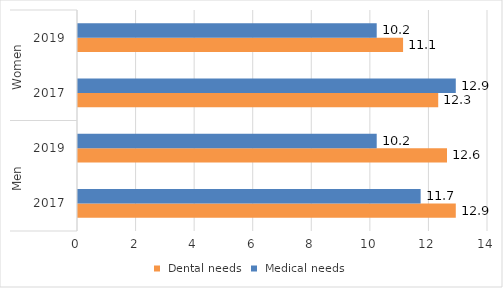
| Category |  Dental needs |  Medical needs |
|---|---|---|
| 0 | 12.9 | 11.7 |
| 1 | 12.6 | 10.2 |
| 2 | 12.3 | 12.9 |
| 3 | 11.1 | 10.2 |